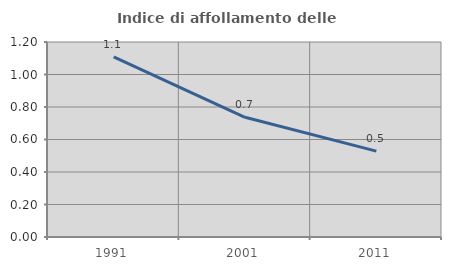
| Category | Indice di affollamento delle abitazioni  |
|---|---|
| 1991.0 | 1.109 |
| 2001.0 | 0.737 |
| 2011.0 | 0.528 |